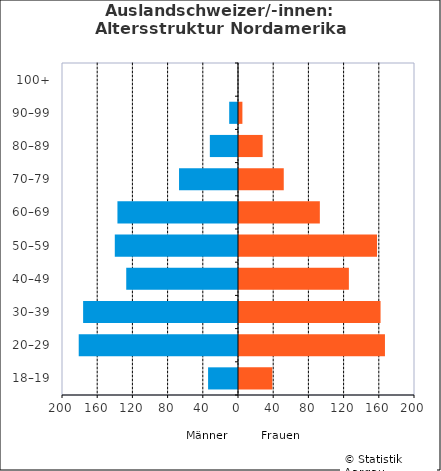
| Category | Männer | Frauen |
|---|---|---|
| 18–19 | -34 | 39 |
| 20–29 | -181 | 167 |
| 30–39 | -176 | 162 |
| 40–49 | -127 | 126 |
| 50–59 | -140 | 158 |
| 60–69 | -137 | 93 |
| 70–79 | -67 | 52 |
| 80–89 | -32 | 28 |
| 90–99 | -10 | 5 |
| 100+ | 0 | 0 |